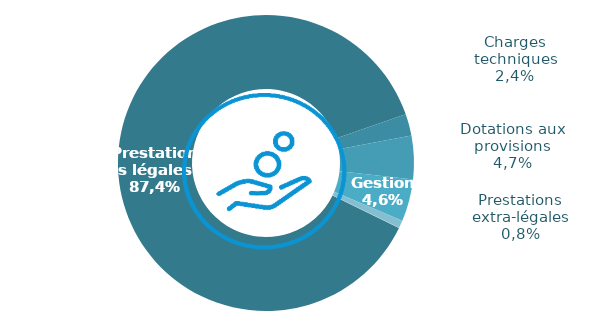
| Category | Series 0 |
|---|---|
| Prestations légales | 13826.068 |
| Charges techniques | 378.067 |
| Dotations aux provisions | 747.846 |
| Gestion | 727.343 |
| Prestations extra-légales | 131.244 |
| Charges financières | 4.18 |
| Autres charges | 0 |